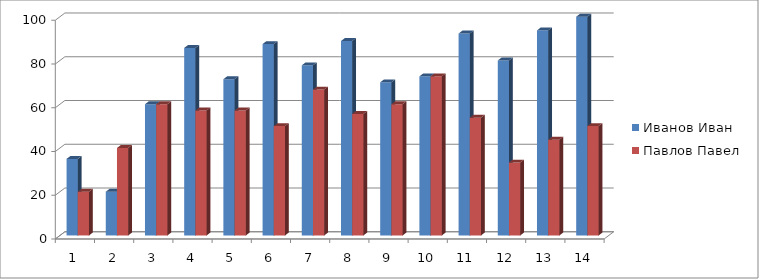
| Category | Иванов Иван | Павлов Павел |
|---|---|---|
| 0 | 35 | 20 |
| 1 | 20 | 40 |
| 2 | 60 | 60 |
| 3 | 85.714 | 57.143 |
| 4 | 71.429 | 57.143 |
| 5 | 87.5 | 50 |
| 6 | 77.778 | 66.667 |
| 7 | 88.889 | 55.556 |
| 8 | 70 | 60 |
| 9 | 72.727 | 72.727 |
| 10 | 92.308 | 53.846 |
| 11 | 80 | 33.333 |
| 12 | 93.75 | 43.75 |
| 13 | 100 | 50 |